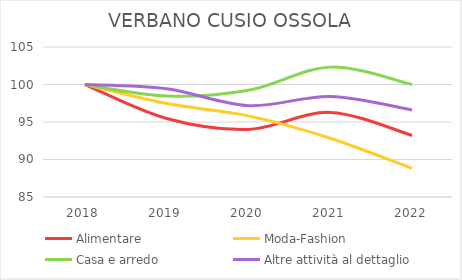
| Category | Alimentare | Moda-Fashion | Casa e arredo | Altre attività al dettaglio |
|---|---|---|---|---|
| 2018.0 | 100 | 100 | 100 | 100 |
| 2019.0 | 95.469 | 97.463 | 98.456 | 99.436 |
| 2020.0 | 94.013 | 95.821 | 99.228 | 97.178 |
| 2021.0 | 96.278 | 92.836 | 102.317 | 98.401 |
| 2022.0 | 93.204 | 88.806 | 100 | 96.613 |